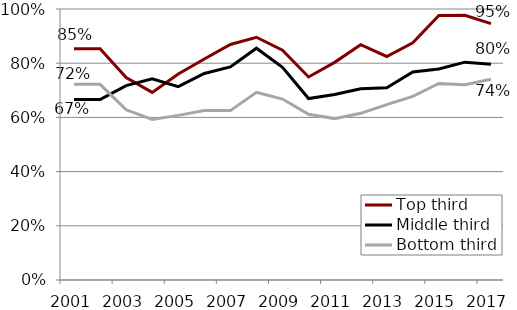
| Category | Top third | Middle third | Bottom third |
|---|---|---|---|
| 2001.0 | 0.854 | 0.666 | 0.722 |
| 2002.0 | 0.854 | 0.666 | 0.722 |
| 2003.0 | 0.747 | 0.717 | 0.628 |
| 2004.0 | 0.692 | 0.742 | 0.592 |
| 2005.0 | 0.76 | 0.713 | 0.608 |
| 2006.0 | 0.815 | 0.762 | 0.626 |
| 2007.0 | 0.869 | 0.786 | 0.625 |
| 2008.0 | 0.896 | 0.855 | 0.693 |
| 2009.0 | 0.848 | 0.785 | 0.668 |
| 2010.0 | 0.749 | 0.67 | 0.612 |
| 2011.0 | 0.803 | 0.685 | 0.596 |
| 2012.0 | 0.868 | 0.706 | 0.615 |
| 2013.0 | 0.825 | 0.709 | 0.647 |
| 2014.0 | 0.876 | 0.767 | 0.677 |
| 2015.0 | 0.976 | 0.779 | 0.725 |
| 2016.0 | 0.976 | 0.804 | 0.721 |
| 2017.0 | 0.946 | 0.796 | 0.741 |